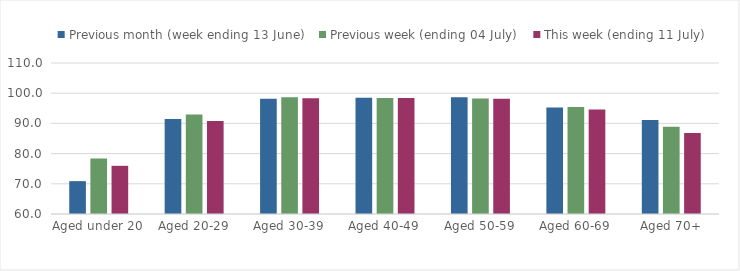
| Category | Previous month (week ending 13 June) | Previous week (ending 04 July) | This week (ending 11 July) |
|---|---|---|---|
| Aged under 20 | 70.88 | 78.374 | 75.959 |
| Aged 20-29 | 91.484 | 92.931 | 90.812 |
| Aged 30-39 | 98.132 | 98.668 | 98.366 |
| Aged 40-49 | 98.49 | 98.385 | 98.43 |
| Aged 50-59 | 98.687 | 98.252 | 98.192 |
| Aged 60-69 | 95.294 | 95.392 | 94.644 |
| Aged 70+ | 91.125 | 88.88 | 86.782 |